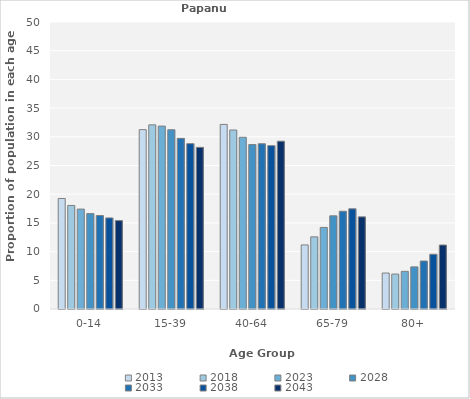
| Category | 2013 | 2018 | 2023 | 2028 | 2033 | 2038 | 2043 |
|---|---|---|---|---|---|---|---|
| 0-14 | 19.253 | 18.041 | 17.409 | 16.627 | 16.289 | 15.869 | 15.402 |
| 15-39 | 31.245 | 32.082 | 31.862 | 31.23 | 29.727 | 28.803 | 28.161 |
| 40-64 | 32.158 | 31.184 | 29.919 | 28.651 | 28.789 | 28.456 | 29.234 |
| 65-79 | 11.162 | 12.571 | 14.211 | 16.23 | 17.031 | 17.452 | 16.054 |
| 80+ | 6.266 | 6.082 | 6.559 | 7.341 | 8.359 | 9.537 | 11.149 |